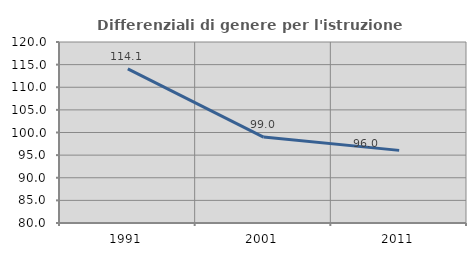
| Category | Differenziali di genere per l'istruzione superiore |
|---|---|
| 1991.0 | 114.072 |
| 2001.0 | 98.982 |
| 2011.0 | 96.049 |